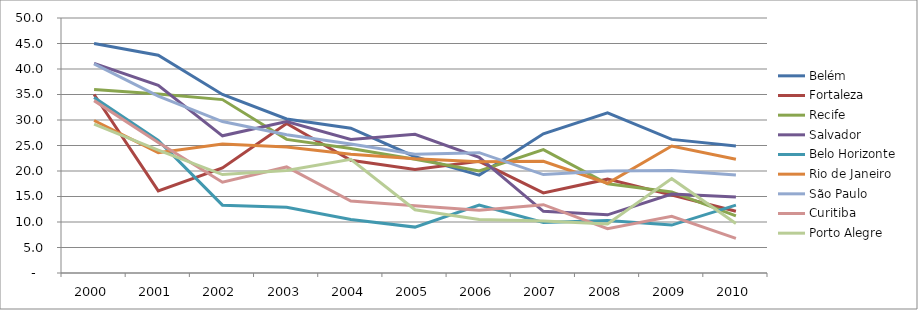
| Category | Belém | Fortaleza | Recife | Salvador | Belo Horizonte | Rio de Janeiro | São Paulo | Curitiba | Porto Alegre |
|---|---|---|---|---|---|---|---|---|---|
| 2000.0 | 45 | 35 | 36 | 41.1 | 34.4 | 29.9 | 41 | 33.8 | 29.2 |
| 2001.0 | 42.7 | 16.1 | 35.1 | 36.8 | 26 | 23.6 | 34.7 | 25.6 | 24.1 |
| 2002.0 | 35 | 20.6 | 34 | 26.9 | 13.3 | 25.3 | 29.7 | 17.8 | 19.3 |
| 2003.0 | 30.2 | 29.3 | 26.2 | 29.7 | 12.9 | 24.7 | 27.1 | 20.8 | 20.1 |
| 2004.0 | 28.4 | 22.1 | 24.4 | 26.2 | 10.5 | 23.3 | 25.3 | 14.1 | 22.3 |
| 2005.0 | 22.8 | 20.3 | 22.3 | 27.2 | 9 | 22.4 | 23.3 | 13.2 | 12.4 |
| 2006.0 | 19.2 | 21.9 | 20 | 22.7 | 13.3 | 21.8 | 23.6 | 12.3 | 10.5 |
| 2007.0 | 27.3 | 15.7 | 24.2 | 12.1 | 9.9 | 21.9 | 19.3 | 13.4 | 10.2 |
| 2008.0 | 31.4 | 18.4 | 17.5 | 11.4 | 10.3 | 17.6 | 20 | 8.7 | 9.6 |
| 2009.0 | 26.2 | 15.3 | 15.9 | 15.5 | 9.4 | 24.9 | 20.1 | 11.1 | 18.5 |
| 2010.0 | 24.9 | 12.1 | 11.2 | 14.9 | 13.3 | 22.3 | 19.2 | 6.8 | 9.7 |